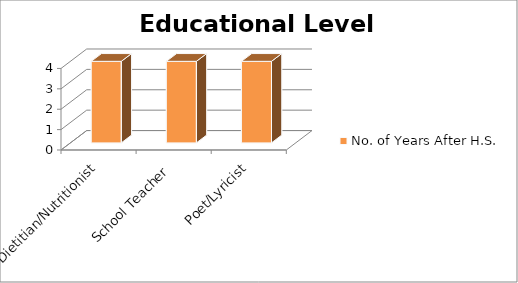
| Category | No. of Years After H.S. |
|---|---|
| Dietitian/Nutritionist | 4 |
| School Teacher | 4 |
| Poet/Lyricist | 4 |